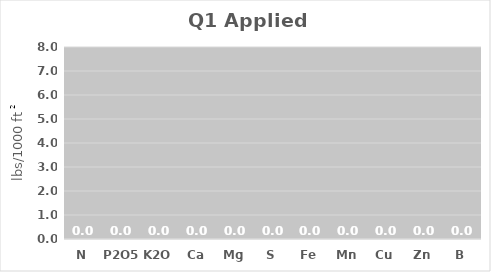
| Category | Q1 Applied Nutrients |
|---|---|
| N | 0 |
| P2O5 | 0 |
| K2O | 0 |
| Ca | 0 |
| Mg | 0 |
| S | 0 |
| Fe | 0 |
| Mn | 0 |
| Cu | 0 |
| Zn | 0 |
| B | 0 |